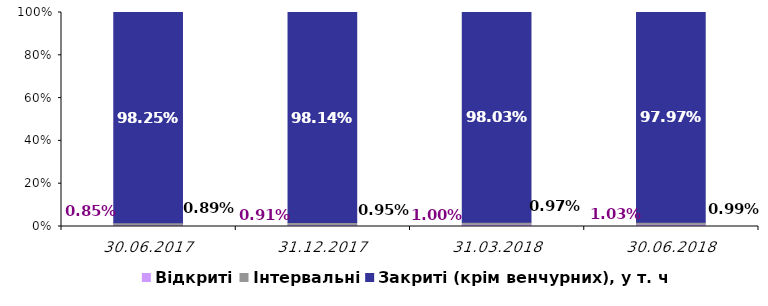
| Category | Відкриті | Інтервальні | Закриті (крім венчурних), у т. ч.: |
|---|---|---|---|
| 30.06.2017 | 0.009 | 0.009 | 0.983 |
| 31.12.2017 | 0.009 | 0.009 | 0.981 |
| 31.03.2018 | 0.01 | 0.01 | 0.98 |
| 30.06.2018 | 0.01 | 0.01 | 0.98 |